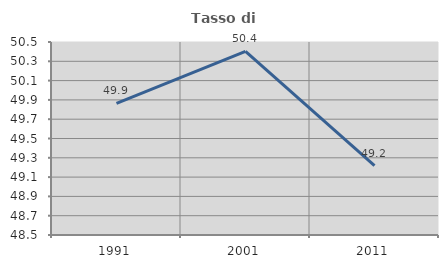
| Category | Tasso di occupazione   |
|---|---|
| 1991.0 | 49.863 |
| 2001.0 | 50.403 |
| 2011.0 | 49.219 |